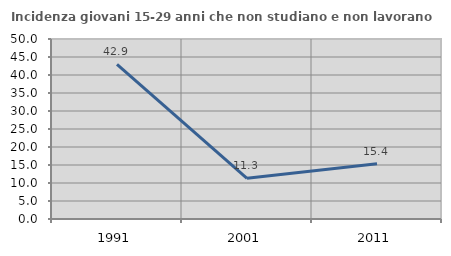
| Category | Incidenza giovani 15-29 anni che non studiano e non lavorano  |
|---|---|
| 1991.0 | 42.926 |
| 2001.0 | 11.305 |
| 2011.0 | 15.364 |